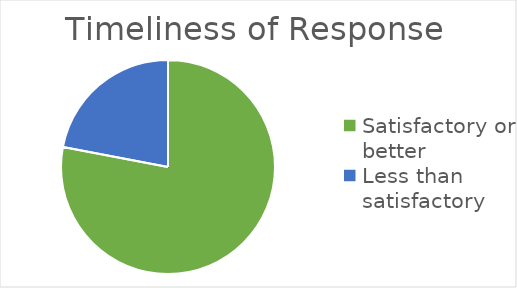
| Category | Series 0 |
|---|---|
| Satisfactory or better | 0.78 |
| Less than satisfactory | 0.22 |